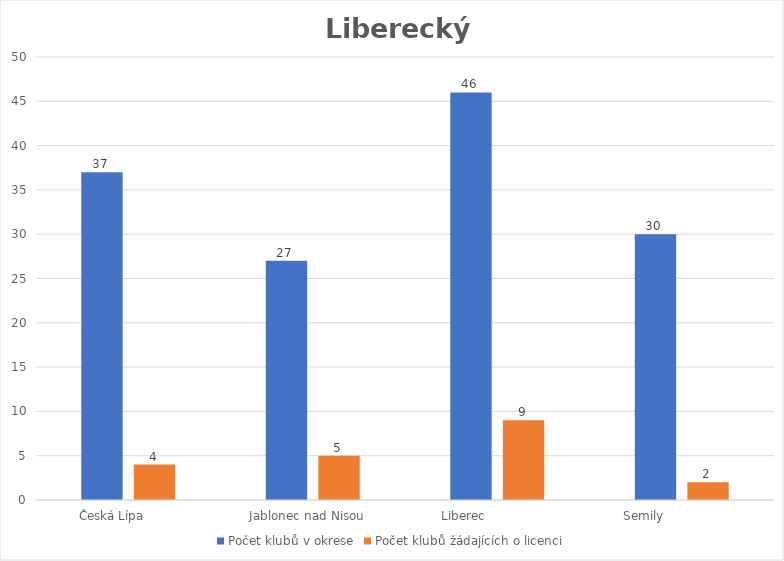
| Category | Počet klubů v okrese | Počet klubů žádajících o licenci |
|---|---|---|
| Česká Lípa         | 37 | 4 |
| Jablonec nad Nisou   | 27 | 5 |
| Liberec                  | 46 | 9 |
| Semily                    | 30 | 2 |